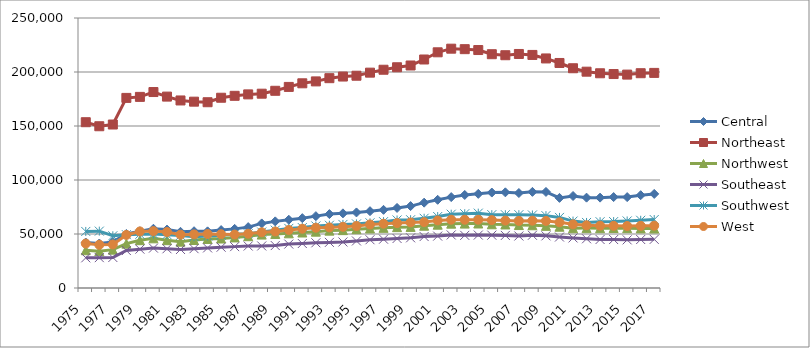
| Category | Central | Northeast | Northwest | Southeast | Southwest | West |
|---|---|---|---|---|---|---|
| 1975 | 42097 | 153502 | 34961 | 27941 | 52351 | 41157 |
| 1976 | 41197 | 149776 | 34128 | 28103 | 52653 | 40014 |
| 1977 | 42694 | 151365 | 35514 | 28247 | 48351 | 40325 |
| 1978 | 50041 | 176016 | 41056 | 34690 | 49373 | 49136 |
| 1979 | 52575 | 176964 | 44283 | 35968 | 49809 | 52365 |
| 1980 | 54853 | 181446 | 45996 | 36934 | 49985 | 52686 |
| 1981 | 54088 | 177223 | 44278 | 36327 | 49380 | 51831 |
| 1982 | 52023 | 173646 | 42910 | 35668 | 48703 | 49400 |
| 1983 | 52569 | 172540 | 44451 | 36419 | 47541 | 49639 |
| 1984 | 52450 | 172012 | 45401 | 37088 | 48099 | 50002 |
| 1985 | 53616 | 176171 | 45822 | 37764 | 48899 | 49794 |
| 1986 | 54745 | 177945 | 46845 | 38310 | 49955 | 49501 |
| 1987 | 56367 | 179273 | 47964 | 38855 | 50347 | 50273 |
| 1988 | 59792 | 179916 | 49452 | 38930 | 51815 | 51604 |
| 1989 | 61700 | 182596 | 50040 | 39304 | 53557 | 52324 |
| 1990 | 63183 | 186188 | 50636 | 40667 | 55186 | 53743 |
| 1991 | 64676 | 189533 | 51388 | 41200 | 55943 | 54880 |
| 1992 | 66536 | 191298 | 52183 | 41852 | 57426 | 55797 |
| 1993 | 68431 | 194279 | 53125 | 42238 | 58115 | 56121 |
| 1994 | 69117 | 195795 | 53577 | 42613 | 58856 | 56664 |
| 1995 | 69961 | 196554 | 54458 | 43560 | 59349 | 57427 |
| 1996 | 71128 | 199400 | 55128 | 44677 | 60361 | 58827 |
| 1997 | 72372 | 202095 | 55700 | 45183 | 61443 | 59518 |
| 1998 | 74145 | 204394 | 56340 | 45843 | 62979 | 60084 |
| 1999 | 75845 | 206019 | 56576 | 46466 | 63223 | 60713 |
| 2000 | 79035 | 211584 | 57681 | 47656 | 64579 | 61015 |
| 2001 | 81665 | 218242 | 58635 | 48046 | 66147 | 62579 |
| 2002 | 84158 | 221598 | 59588 | 49121 | 68330 | 63233 |
| 2003 | 86148 | 221140 | 59630 | 48745 | 68740 | 63199 |
| 2004 | 87160 | 220338 | 59711 | 49006 | 69307 | 63200 |
| 2005 | 88374 | 216468 | 59004 | 48923 | 67898 | 62893 |
| 2006 | 88573 | 215526 | 58830 | 48693 | 67863 | 62419 |
| 2007 | 87937 | 216685 | 58277 | 48140 | 67872 | 62119 |
| 2008 | 89009 | 215804 | 58105 | 48826 | 67623 | 62336 |
| 2009 | 88959 | 212555 | 57563 | 48291 | 67008 | 62138 |
| 2010 | 83441 | 208350 | 56743 | 47189 | 65352 | 60855 |
| 2011 | 85181 | 203481 | 55377 | 46354 | 61955 | 58944 |
| 2012 | 83652 | 200299 | 55452 | 45577 | 60681 | 58122 |
| 2013 | 83676 | 198815 | 55374 | 44914 | 61371 | 57717 |
| 2014 | 84191 | 198109 | 55530 | 44868 | 61481 | 57584 |
| 2015 | 84161 | 197596 | 55404 | 44564 | 62076 | 57390 |
| 2016 | 85937 | 198883 | 55203 | 44907 | 62702 | 57574 |
| 2017 | 87118 | 199168 | 55092 | 45049 | 63378 | 57706 |